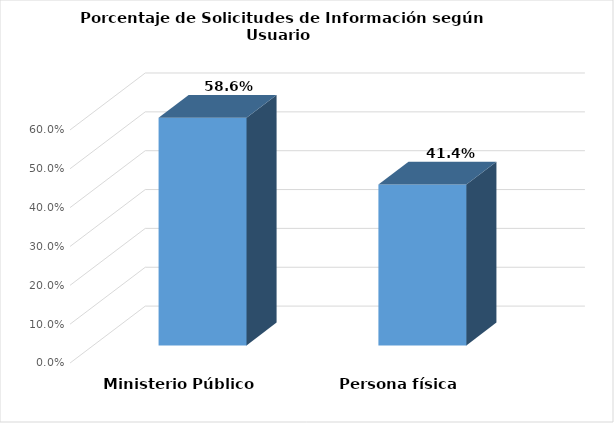
| Category | Series 0 |
|---|---|
| Ministerio Público | 0.586 |
| Persona física | 0.414 |